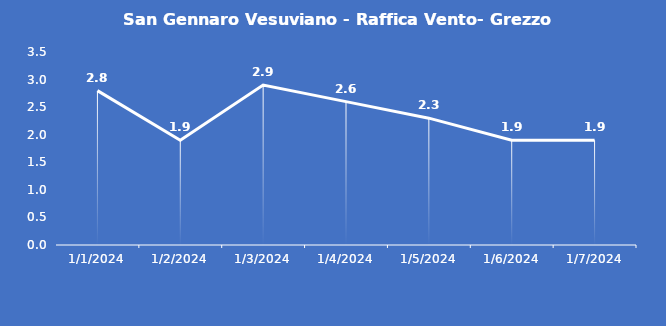
| Category | San Gennaro Vesuviano - Raffica Vento- Grezzo (m/s) |
|---|---|
| 1/1/24 | 2.8 |
| 1/2/24 | 1.9 |
| 1/3/24 | 2.9 |
| 1/4/24 | 2.6 |
| 1/5/24 | 2.3 |
| 1/6/24 | 1.9 |
| 1/7/24 | 1.9 |